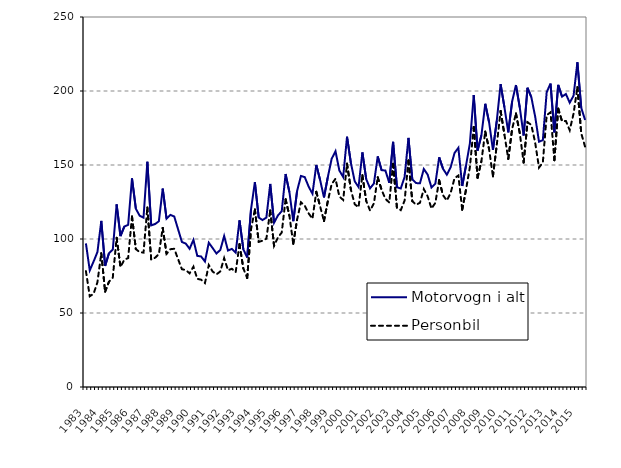
| Category | Motorvogn i alt | Personbil |
|---|---|---|
| 1983.0 | 97 | 78.3 |
| nan | 78.8 | 61.3 |
| nan | 84.8 | 63 |
| nan | 91.2 | 70.8 |
| 1984.0 | 112.2 | 90.4 |
| nan | 81.8 | 64.4 |
| nan | 90.4 | 71.1 |
| nan | 92.9 | 73.9 |
| 1985.0 | 123.4 | 100.8 |
| nan | 102 | 81.1 |
| nan | 108.4 | 86 |
| nan | 109.6 | 87.1 |
| 1986.0 | 141 | 115.2 |
| nan | 120.5 | 93.2 |
| nan | 115.7 | 91.1 |
| nan | 114.4 | 90.8 |
| 1987.0 | 152.2 | 121.3 |
| nan | 109.2 | 86.1 |
| nan | 110.1 | 87.3 |
| nan | 112 | 89.8 |
| 1988.0 | 134.1 | 107.5 |
| nan | 113.7 | 90 |
| nan | 116.3 | 93.1 |
| nan | 115.2 | 93.4 |
| 1989.0 | 106.6 | 86.4 |
| nan | 98 | 79.6 |
| nan | 96.9 | 79 |
| nan | 93.4 | 76.8 |
| 1990.0 | 99.4 | 81.3 |
| nan | 88.6 | 73.1 |
| nan | 88.2 | 72.5 |
| nan | 84.8 | 70.2 |
| 1991.0 | 97.5 | 82.4 |
| nan | 93.9 | 78 |
| nan | 90.2 | 76.1 |
| nan | 92.6 | 78.1 |
| 1992.0 | 102 | 87.1 |
| nan | 92.2 | 78.9 |
| nan | 93.3 | 79.9 |
| nan | 90.8 | 77.6 |
| 1993.0 | 112.6 | 96.5 |
| nan | 93 | 80.1 |
| nan | 87.5 | 73.6 |
| nan | 120.1 | 106.6 |
| 1994.0 | 138.4 | 120 |
| nan | 114.5 | 98.1 |
| nan | 112.8 | 98.8 |
| nan | 114.5 | 100.2 |
| 1995.0 | 137.2 | 119.3 |
| nan | 111 | 95.4 |
| nan | 115.9 | 101 |
| nan | 118.8 | 104.4 |
| 1996.0 | 143.9 | 126.9 |
| nan | 131.6 | 115.7 |
| nan | 112 | 96.7 |
| nan | 132.5 | 113.1 |
| 1997.0 | 142.6 | 124.8 |
| nan | 141.8 | 122.5 |
| nan | 135.4 | 117.3 |
| nan | 130.6 | 113.7 |
| 1998.0 | 150 | 131.9 |
| nan | 139.8 | 122 |
| nan | 128.1 | 112.1 |
| nan | 141.8 | 125.6 |
| 1999.0 | 154.2 | 137.1 |
| nan | 159.3 | 140.7 |
| nan | 146.3 | 128.7 |
| nan | 141.9 | 126.4 |
| 2000.0 | 169.1 | 150.9 |
| nan | 151.5 | 133.4 |
| nan | 139 | 123.5 |
| nan | 135.1 | 121.4 |
| 2001.0 | 158.5 | 143.1 |
| nan | 140.46 | 125.7 |
| nan | 134.24 | 119.2 |
| nan | 137.495 | 124.072 |
| 2002.0 | 155.814 | 141.724 |
| nan | 146.543 | 133.19 |
| nan | 146.231 | 127.141 |
| nan | 137.967 | 124.641 |
| 2003.0 | 165.679 | 150.811 |
| nan | 135.021 | 121.101 |
| nan | 134.111 | 119.491 |
| nan | 142.013 | 125.959 |
| 2004.0 | 168.309 | 153.043 |
| nan | 140.267 | 125.568 |
| nan | 137.77 | 123.121 |
| nan | 137.685 | 124.506 |
| 2005.0 | 147.311 | 133.756 |
| nan | 143.517 | 128.79 |
| nan | 134.783 | 120.571 |
| nan | 137.37 | 124.382 |
| 2006.0 | 155.213 | 139.728 |
| nan | 147.444 | 129.572 |
| nan | 143.451 | 126.006 |
| nan | 148.561 | 131.195 |
| 2007.0 | 158.1 | 141.084 |
| nan | 161.613 | 142.897 |
| nan | 135.821 | 119.753 |
| nan | 149.791 | 133.498 |
| 2008.0 | 164.642 | 148.614 |
| nan | 197.287 | 175.714 |
| nan | 159.718 | 141.407 |
| nan | 170.057 | 152.54 |
| 2009.0 | 191.38 | 172.559 |
| nan | 178.906 | 160.765 |
| nan | 160.234 | 142.312 |
| nan | 179.857 | 163.532 |
| 2010.0 | 204.636 | 186.507 |
| nan | 188.957 | 170.463 |
| nan | 172.077 | 154.156 |
| nan | 192.961 | 174.399 |
| 2011.0 | 204.005 | 184.86 |
| nan | 188.741 | 171.333 |
| nan | 169.934 | 151.694 |
| nan | 202.176 | 178.919 |
| 2012.0 | 195.829 | 177.072 |
| nan | 182.751 | 165.128 |
| nan | 165.73 | 148.242 |
| nan | 166.805 | 151.728 |
| 2013.0 | 199.181 | 183.653 |
| nan | 205.015 | 185.634 |
| nan | 172.044 | 153.21 |
| nan | 204.1 | 188.079 |
| 2014.0 | 196.177 | 179.552 |
| nan | 197.965 | 179.767 |
| nan | 192.105 | 173.474 |
| nan | 196.809 | 184.739 |
| 2015.0 | 219.419 | 202.592 |
| nan | 188.696 | 171.451 |
| nan | 180.388 | 162.297 |